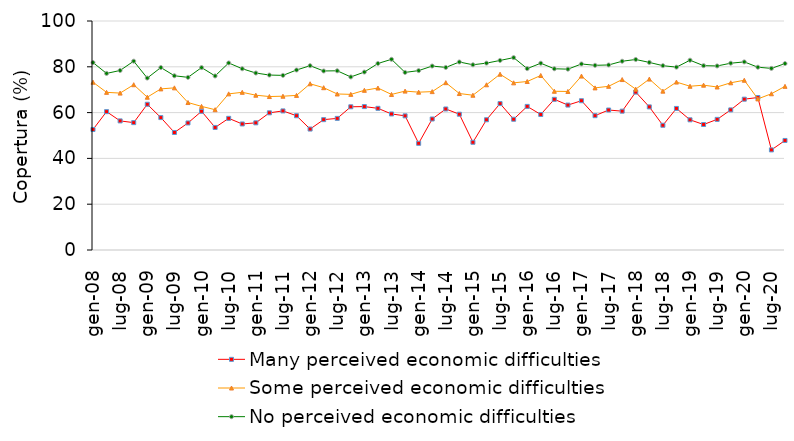
| Category | Many perceived economic difficulties | Some perceived economic difficulties | No perceived economic difficulties |
|---|---|---|---|
| gen-08 | 52.627 | 73.267 | 81.852 |
| apr-08 | 60.422 | 68.842 | 77.103 |
| lug-08 | 56.375 | 68.52 | 78.405 |
| ott-08 | 55.617 | 72.181 | 82.46 |
| gen-09 | 63.637 | 66.727 | 75.082 |
| apr-09 | 57.822 | 70.352 | 79.683 |
| lug-09 | 51.315 | 70.81 | 76.085 |
| ott-09 | 55.477 | 64.401 | 75.39 |
| gen-10 | 60.567 | 62.717 | 79.662 |
| apr-10 | 53.512 | 61.262 | 76.013 |
| lug-10 | 57.495 | 68.18 | 81.675 |
| ott-10 | 55.037 | 68.861 | 79.15 |
| gen-11 | 55.527 | 67.597 | 77.282 |
| apr-11 | 59.902 | 67.012 | 76.393 |
| lug-11 | 60.735 | 67.16 | 76.255 |
| ott-11 | 58.627 | 67.521 | 78.6 |
| gen-12 | 52.817 | 72.587 | 80.482 |
| apr-12 | 56.922 | 70.872 | 78.173 |
| lug-12 | 57.475 | 68.13 | 78.255 |
| ott-12 | 62.537 | 67.961 | 75.57 |
| gen-13 | 62.627 | 69.727 | 77.702 |
| apr-13 | 61.862 | 70.732 | 81.453 |
| lug-13 | 59.405 | 67.93 | 83.265 |
| ott-13 | 58.587 | 69.391 | 77.54 |
| gen-14 | 46.587 | 68.927 | 78.342 |
| apr-14 | 57.212 | 69.162 | 80.333 |
| lug-14 | 61.585 | 73.07 | 79.725 |
| ott-14 | 59.297 | 68.331 | 82.1 |
| gen-15 | 47.047 | 67.587 | 80.882 |
| apr-15 | 56.872 | 72.142 | 81.603 |
| lug-15 | 63.935 | 76.77 | 82.775 |
| ott-15 | 57.097 | 73.001 | 84.01 |
| gen-16 | 62.707 | 73.577 | 79.212 |
| apr-16 | 59.172 | 76.212 | 81.553 |
| lug-16 | 65.805 | 69.31 | 79.145 |
| ott-16 | 63.287 | 69.231 | 78.97 |
| gen-17 | 65.187 | 75.947 | 81.242 |
| apr-17 | 58.662 | 70.792 | 80.643 |
| lug-17 | 61.125 | 71.48 | 80.805 |
| ott-17 | 60.627 | 74.431 | 82.43 |
| gen-18 | 68.957 | 70.237 | 83.192 |
| apr-18 | 62.492 | 74.632 | 81.913 |
| lug-18 | 54.465 | 69.37 | 80.495 |
| ott-18 | 61.817 | 73.331 | 79.85 |
| gen-19 | 56.847 | 71.507 | 82.872 |
| apr-19 | 54.802 | 71.982 | 80.493 |
| lug-19 | 57.045 | 71.18 | 80.375 |
| ott-19 | 61.177 | 73.021 | 81.57 |
| gen-20 | 65.857 | 74.127 | 82.142 |
| apr-20 | 66.582 | 65.982 | 79.823 |
| lug-20 | 43.715 | 68.23 | 79.305 |
| ott-20 | 47.837 | 71.471 | 81.41 |